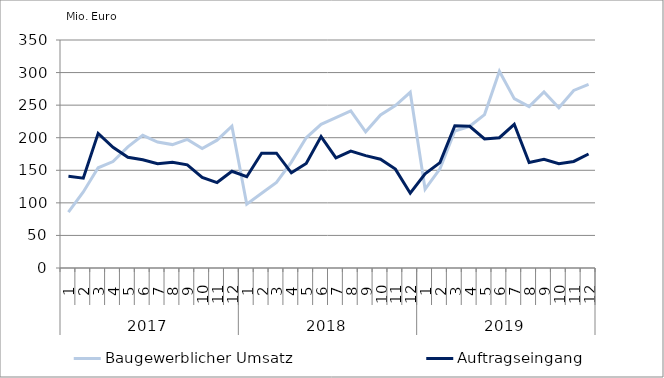
| Category | Baugewerblicher Umsatz | Auftragseingang |
|---|---|---|
| 0 | 85701.947 | 140751.008 |
| 1 | 116743.276 | 137863.383 |
| 2 | 153810.055 | 206710.579 |
| 3 | 163342.989 | 185183.797 |
| 4 | 185946.221 | 169878.51 |
| 5 | 203627.91 | 166148.392 |
| 6 | 193377.256 | 160134.206 |
| 7 | 189429.952 | 162221.206 |
| 8 | 197405.279 | 158305.285 |
| 9 | 183450.026 | 139156.761 |
| 10 | 196209.214 | 131165.419 |
| 11 | 217688.447 | 148434.901 |
| 12 | 97959.056 | 140119.385 |
| 13 | 114756.787 | 176330.213 |
| 14 | 131454.642 | 176241.061 |
| 15 | 162648.053 | 146063.407 |
| 16 | 199809.407 | 160551.931 |
| 17 | 220535.974 | 201835.846 |
| 18 | 230672.472 | 169132.23 |
| 19 | 241233.619 | 179396.293 |
| 20 | 209099.292 | 172542.764 |
| 21 | 234953.007 | 166991.729 |
| 22 | 249410.043 | 151835.629 |
| 23 | 269773.227 | 114807.456 |
| 24 | 120975.133 | 144510.881 |
| 25 | 152329.786 | 161685.201 |
| 26 | 210227.67 | 218455.879 |
| 27 | 217522.321 | 217610.064 |
| 28 | 235490.429 | 198110.439 |
| 29 | 301963.302 | 200012.086 |
| 30 | 259975.317 | 220559.061 |
| 31 | 247779.658 | 162059.723 |
| 32 | 270249.609 | 166829.611 |
| 33 | 245966.91 | 160120.773 |
| 34 | 272620.351 | 163589.389 |
| 35 | 281810.121 | 175051.247 |